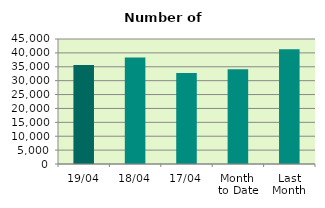
| Category | Series 0 |
|---|---|
| 19/04 | 35678 |
| 18/04 | 38356 |
| 17/04 | 32730 |
| Month 
to Date | 34069.636 |
| Last
Month | 41301.217 |